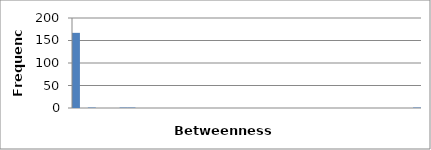
| Category | 167 |
|---|---|
| 0.0 | 167 |
| 5.3023255813953485 | 0 |
| 10.604651162790697 | 1 |
| 15.906976744186046 | 0 |
| 21.209302325581394 | 0 |
| 26.51162790697674 | 0 |
| 31.81395348837209 | 1 |
| 37.11627906976744 | 1 |
| 42.41860465116279 | 0 |
| 47.72093023255814 | 0 |
| 53.02325581395349 | 0 |
| 58.32558139534884 | 0 |
| 63.62790697674419 | 0 |
| 68.93023255813954 | 0 |
| 74.23255813953489 | 0 |
| 79.53488372093024 | 0 |
| 84.83720930232559 | 0 |
| 90.13953488372094 | 0 |
| 95.44186046511629 | 0 |
| 100.74418604651164 | 0 |
| 106.046511627907 | 0 |
| 111.34883720930235 | 0 |
| 116.6511627906977 | 0 |
| 121.95348837209305 | 0 |
| 127.2558139534884 | 0 |
| 132.55813953488374 | 0 |
| 137.86046511627907 | 0 |
| 143.1627906976744 | 0 |
| 148.46511627906975 | 0 |
| 153.76744186046508 | 0 |
| 159.06976744186042 | 0 |
| 164.37209302325576 | 0 |
| 169.6744186046511 | 0 |
| 174.97674418604643 | 0 |
| 180.27906976744177 | 0 |
| 185.5813953488371 | 0 |
| 190.88372093023244 | 0 |
| 196.18604651162778 | 0 |
| 201.48837209302312 | 0 |
| 206.79069767441845 | 0 |
| 212.0930232558138 | 0 |
| 217.39534883720913 | 0 |
| 222.69767441860446 | 0 |
| 228.0 | 1 |